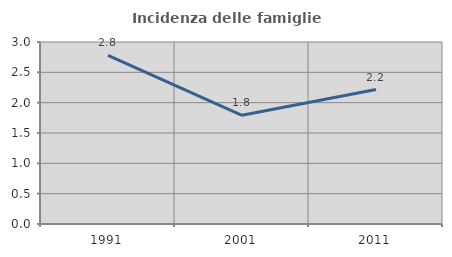
| Category | Incidenza delle famiglie numerose |
|---|---|
| 1991.0 | 2.781 |
| 2001.0 | 1.791 |
| 2011.0 | 2.217 |